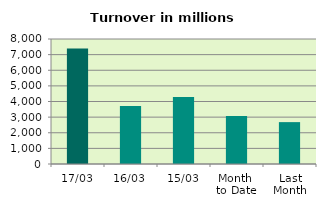
| Category | Series 0 |
|---|---|
| 17/03 | 7393.653 |
| 16/03 | 3707.901 |
| 15/03 | 4287.884 |
| Month 
to Date | 3075.602 |
| Last
Month | 2679.99 |